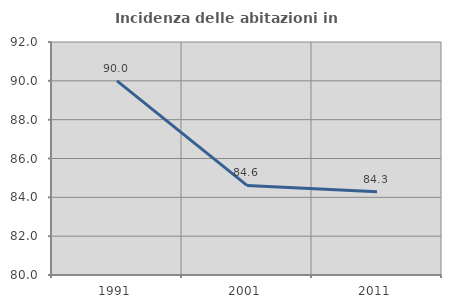
| Category | Incidenza delle abitazioni in proprietà  |
|---|---|
| 1991.0 | 90 |
| 2001.0 | 84.615 |
| 2011.0 | 84.286 |